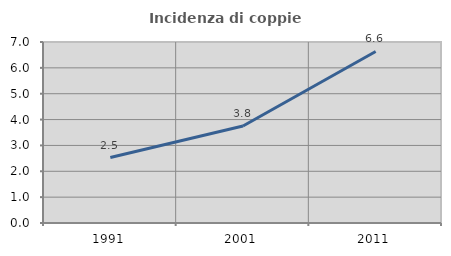
| Category | Incidenza di coppie miste |
|---|---|
| 1991.0 | 2.532 |
| 2001.0 | 3.753 |
| 2011.0 | 6.634 |